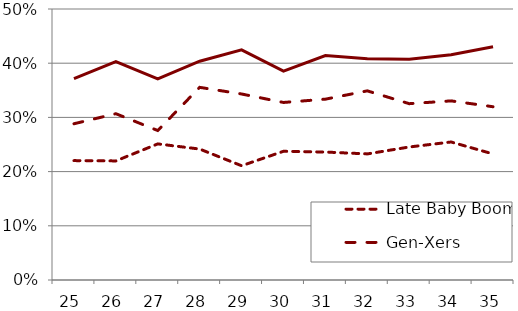
| Category | Late Baby Boomers | Gen-Xers | Millennials |
|---|---|---|---|
| 25.0 | 0.22 | 0.288 | 0.371 |
| 26.0 | 0.22 | 0.307 | 0.403 |
| 27.0 | 0.251 | 0.276 | 0.371 |
| 28.0 | 0.242 | 0.355 | 0.404 |
| 29.0 | 0.211 | 0.343 | 0.425 |
| 30.0 | 0.237 | 0.328 | 0.385 |
| 31.0 | 0.236 | 0.334 | 0.414 |
| 32.0 | 0.233 | 0.349 | 0.408 |
| 33.0 | 0.245 | 0.325 | 0.407 |
| 34.0 | 0.255 | 0.33 | 0.416 |
| 35.0 | 0.233 | 0.32 | 0.431 |